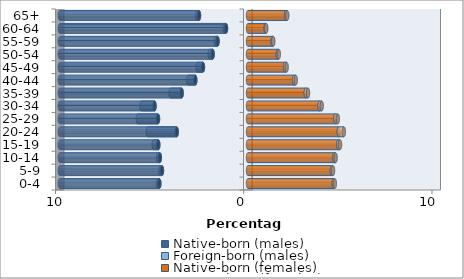
| Category | Native-born (males) | Foreign-born (males) | Native-born (females) | Foreign-born (females) |
|---|---|---|---|---|
| 0-4 | -4.711 | -0.069 | 4.555 | 0.057 |
| 5-9 | -4.572 | -0.084 | 4.454 | 0.064 |
| 10-14 | -4.685 | -0.097 | 4.592 | 0.064 |
| 15-19 | -4.767 | -0.245 | 4.797 | 0.093 |
| 20-24 | -3.787 | -1.549 | 4.823 | 0.269 |
| 25-29 | -4.782 | -1.07 | 4.639 | 0.133 |
| 30-34 | -4.966 | -0.689 | 3.804 | 0.114 |
| 35-39 | -3.526 | -0.591 | 3.067 | 0.121 |
| 40-44 | -2.801 | -0.377 | 2.445 | 0.091 |
| 45-49 | -2.393 | -0.283 | 1.97 | 0.081 |
| 50-54 | -1.878 | -0.16 | 1.582 | 0.055 |
| 55-59 | -1.618 | -0.091 | 1.304 | 0.038 |
| 60-64 | -1.17 | -0.063 | 0.937 | 0.032 |
| 65+ | -2.604 | -0.103 | 2.022 | 0.064 |